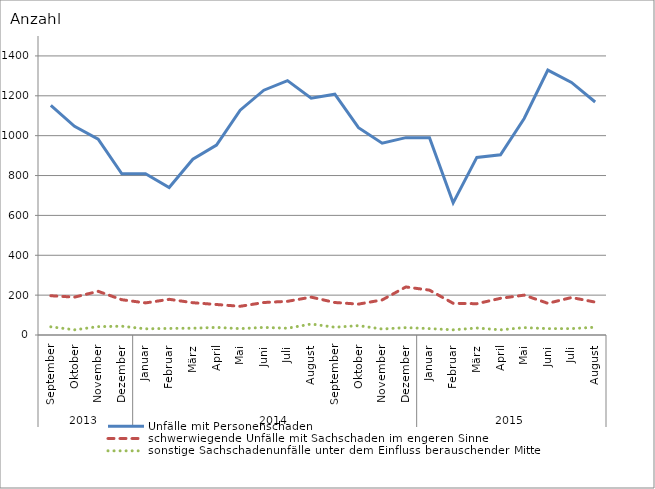
| Category | Unfälle mit Personenschaden | schwerwiegende Unfälle mit Sachschaden im engeren Sinne | sonstige Sachschadenunfälle unter dem Einfluss berauschender Mittel |
|---|---|---|---|
| 0 | 1152 | 197 | 41 |
| 1 | 1047 | 190 | 26 |
| 2 | 983 | 219 | 42 |
| 3 | 809 | 177 | 44 |
| 4 | 809 | 161 | 31 |
| 5 | 740 | 179 | 33 |
| 6 | 882 | 162 | 34 |
| 7 | 953 | 153 | 38 |
| 8 | 1128 | 144 | 32 |
| 9 | 1228 | 163 | 38 |
| 10 | 1276 | 169 | 34 |
| 11 | 1188 | 190 | 55 |
| 12 | 1208 | 163 | 39 |
| 13 | 1040 | 155 | 47 |
| 14 | 962 | 176 | 30 |
| 15 | 990 | 241 | 37 |
| 16 | 990 | 225 | 32 |
| 17 | 663 | 159 | 26 |
| 18 | 891 | 157 | 35 |
| 19 | 904 | 184 | 26 |
| 20 | 1086 | 200 | 37 |
| 21 | 1329 | 159 | 32 |
| 22 | 1267 | 188 | 32 |
| 23 | 1169 | 165 | 39 |